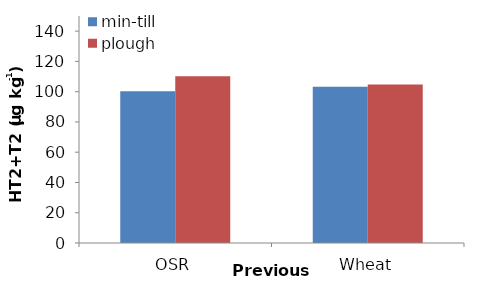
| Category | min-till | plough |
|---|---|---|
| OSR | 100.231 | 110.154 |
| Wheat | 103.276 | 104.713 |